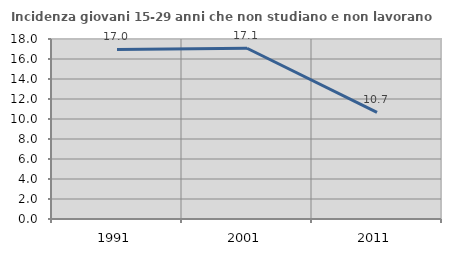
| Category | Incidenza giovani 15-29 anni che non studiano e non lavorano  |
|---|---|
| 1991.0 | 16.959 |
| 2001.0 | 17.073 |
| 2011.0 | 10.667 |